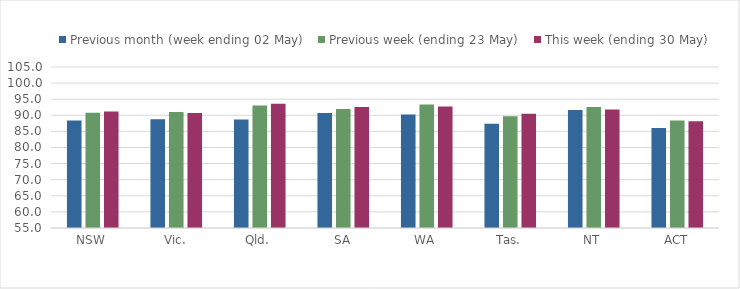
| Category | Previous month (week ending 02 May) | Previous week (ending 23 May) | This week (ending 30 May) |
|---|---|---|---|
| NSW | 88.38 | 90.822 | 91.158 |
| Vic. | 88.743 | 90.992 | 90.713 |
| Qld. | 88.691 | 93.042 | 93.595 |
| SA | 90.724 | 91.964 | 92.592 |
| WA | 90.215 | 93.321 | 92.706 |
| Tas. | 87.354 | 89.729 | 90.504 |
| NT | 91.66 | 92.559 | 91.769 |
| ACT | 86.057 | 88.407 | 88.153 |